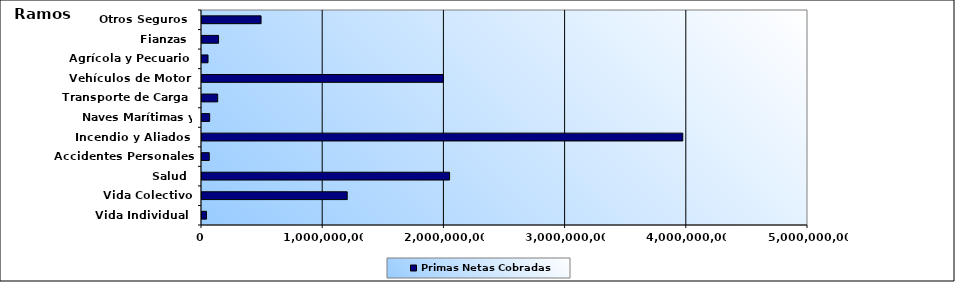
| Category | Primas Netas Cobradas |
|---|---|
| Vida Individual  | 37203140.62 |
| Vida Colectivo | 1198107695.74 |
| Salud  | 2042639087.51 |
| Accidentes Personales | 59999999.46 |
| Incendio y Aliados  | 3966846365.97 |
| Naves Marítimas y Aéreas  | 63270778.34 |
| Transporte de Carga  | 129558777.95 |
| Vehículos de Motor  | 1991248746.06 |
| Agrícola y Pecuario  | 49725959.15 |
| Fianzas  | 136528588.48 |
| Otros Seguros  | 487236121.54 |